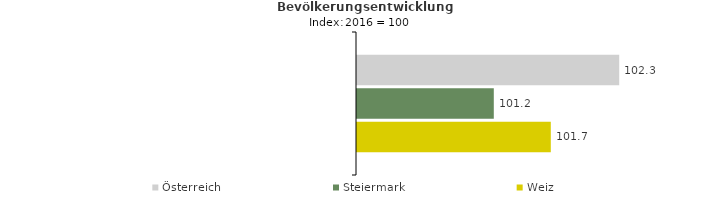
| Category | Österreich | Steiermark | Weiz |
|---|---|---|---|
| 2020.0 | 102.3 | 101.2 | 101.7 |